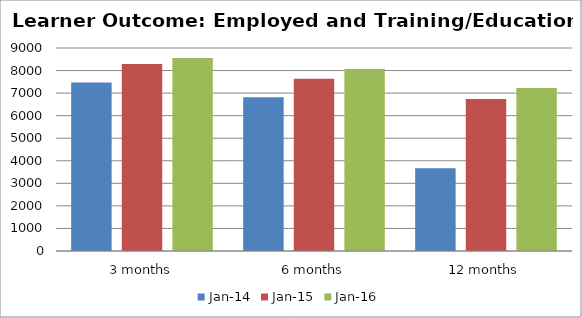
| Category | Jan-14 | Jan-15 | Jan-16 |
|---|---|---|---|
| 3 months | 7465 | 8291 | 8556 |
| 6 months | 6816 | 7641 | 8064 |
| 12 months | 3673 | 6740 | 7232 |